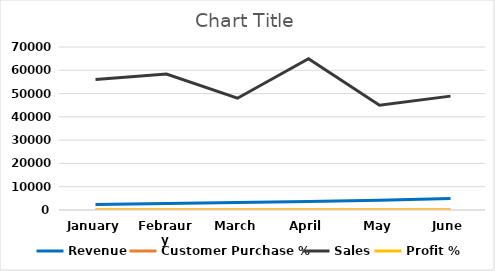
| Category | Revenue | Customer Purchase % | Sales | Profit % |
|---|---|---|---|---|
| January  | 2400 | 0.75 | 56000 | 0.65 |
| Febraury | 2800 | 0.89 | 58400 | 0.75 |
| March | 3200 | 0.79 | 48000 | 0.58 |
| April | 3600 | 0.86 | 65000 | 0.95 |
| May | 4200 | 0.56 | 45000 | 0.59 |
| June | 4900 | 0.48 | 48900 | 0.85 |